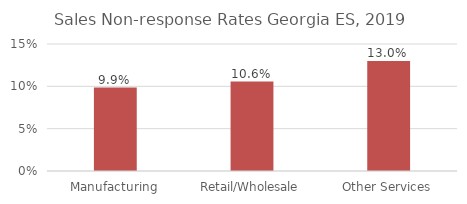
| Category | Series 0 |
|---|---|
| Manufacturing | 0.099 |
| Retail/Wholesale | 0.106 |
| Other Services | 0.13 |